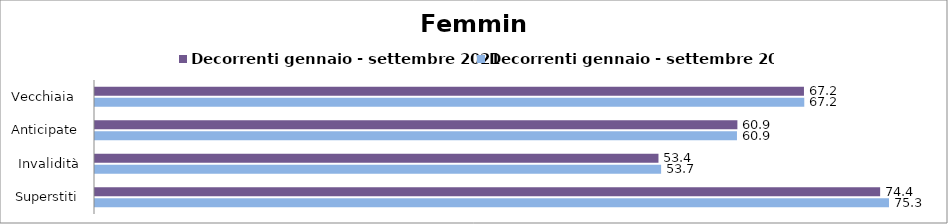
| Category | Decorrenti gennaio - settembre 2021 | Decorrenti gennaio - settembre 2022 |
|---|---|---|
| Vecchiaia  | 67.2 | 67.23 |
| Anticipate | 60.89 | 60.85 |
| Invalidità | 53.41 | 53.66 |
| Superstiti | 74.42 | 75.26 |